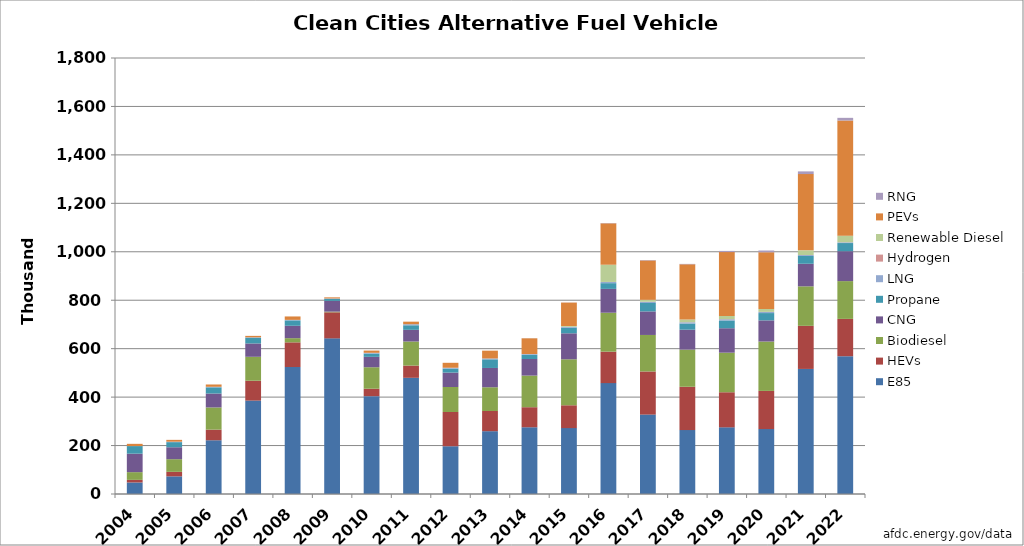
| Category | E85 | HEVs | Biodiesel | CNG | Propane | LNG | Hydrogen | Renewable Diesel | PEVs | RNG |
|---|---|---|---|---|---|---|---|---|---|---|
| 2004.0 | 47643 | 10674 | 31922 | 76257 | 31338 | 0 | 23 | 0 | 9241 | 0 |
| 2005.0 | 72899 | 18553 | 52275 | 49271 | 21117 | 1873 | 42 | 0 | 7464 | 0 |
| 2006.0 | 221834 | 43886 | 91584 | 57458 | 25543 | 2271 | 72 | 0 | 9481 | 0 |
| 2007.0 | 385671 | 81987 | 98785 | 55021 | 23628 | 1731 | 86 | 0 | 5895 | 0 |
| 2008.0 | 524169 | 101954 | 17222 | 51121 | 22260 | 2053 | 75 | 0 | 14135 | 0 |
| 2009.0 | 642520 | 107585 | 2814 | 44317 | 7937 | 2038 | 74 | 0 | 4568 | 0 |
| 2010.0 | 403981 | 30613 | 88726 | 42911 | 13196 | 3410 | 62 | 0 | 9223 | 0 |
| 2011.0 | 479706 | 50503 | 99347 | 48157 | 18793 | 4315 | 118 | 0 | 10541 | 0 |
| 2012.0 | 197187 | 141406 | 103106 | 59521 | 16501 | 3411 | 50 | 0 | 20455 | 0 |
| 2013.0 | 259337 | 83339 | 98028 | 79616 | 35554 | 3645 | 46 | 0 | 32187 | 0 |
| 2014.0 | 275508 | 82834 | 130540 | 68479 | 17404 | 2992 | 49 | 0 | 65042 | 313 |
| 2015.0 | 271996 | 94330 | 189823 | 107283 | 22762 | 3974 | 95 | 3183 | 96896 | 366 |
| 2016.0 | 457817 | 129827 | 160763 | 98388 | 23648 | 4924 | 97 | 71066 | 171011 | 1157 |
| 2017.0 | 327865 | 178011 | 150695 | 97271 | 34753 | 5070 | 116 | 7819 | 162811 | 1734 |
| 2018.0 | 263967 | 178733 | 153380 | 82266 | 25395 | 5100 | 402 | 11174 | 227854 | 1677 |
| 2019.0 | 275216 | 144875 | 163366 | 100938 | 31985 | 4917 | 691 | 13109 | 263543 | 4922 |
| 2020.0 | 268047 | 157540 | 203839 | 87392 | 30156 | 4510 | 413 | 11807 | 234277 | 7229 |
| 2021.0 | 516313 | 177900 | 163116 | 93153 | 31982 | 3969 | 371 | 19089 | 314936 | 11043 |
| 2022.0 | 568837 | 154089 | 155978 | 123463 | 33716 | 2860 | 276 | 27377 | 475330 | 11002 |